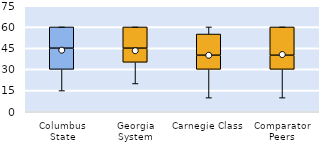
| Category | 25th | 50th | 75th |
|---|---|---|---|
| Columbus State | 30 | 15 | 15 |
| Georgia System | 35 | 10 | 15 |
| Carnegie Class | 30 | 10 | 15 |
| Comparator Peers | 30 | 10 | 20 |